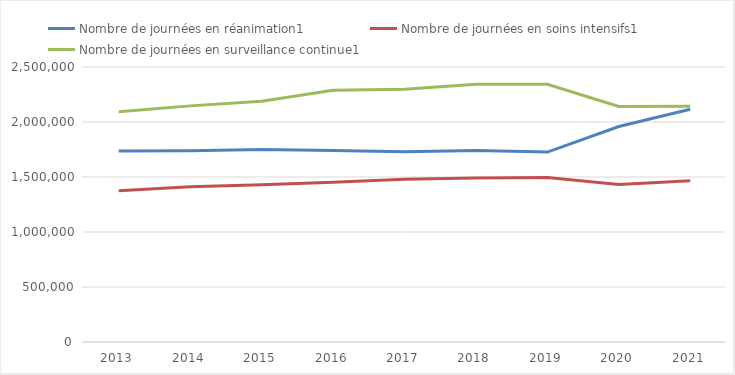
| Category | Nombre de journées en réanimation1 | Nombre de journées en soins intensifs1 | Nombre de journées en surveillance continue1 |
|---|---|---|---|
| 2013.0 | 1735303 | 1374882 | 2094155 |
| 2014.0 | 1737679 | 1411378 | 2146553 |
| 2015.0 | 1750916 | 1429814 | 2189124 |
| 2016.0 | 1740523 | 1451965 | 2288157 |
| 2017.0 | 1729716 | 1480409 | 2297691 |
| 2018.0 | 1741295 | 1490743 | 2344236 |
| 2019.0 | 1726430 | 1494566 | 2342488 |
| 2020.0 | 1959329 | 1431503 | 2141573 |
| 2021.0 | 2115254 | 1465217 | 2142253 |